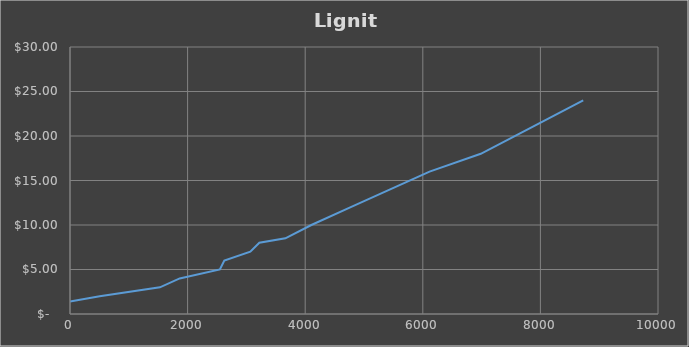
| Category | Series 0 |
|---|---|
| 0.0 | 1.4 |
| 504.57000000000005 | 2 |
| 1529.0 | 3 |
| 1865.6 | 4 |
| 2549.0 | 5 |
| 2624.57 | 6 |
| 3066.8069600000003 | 7 |
| 3220.23696 | 8 |
| 3662.4739200000004 | 8.5 |
| 4104.7108800000005 | 10 |
| 4774.76688 | 12 |
| 5444.82288 | 14 |
| 6114.878879999999 | 16 |
| 6985.951679999999 | 18 |
| 7857.024479999999 | 21 |
| 8728.097279999998 | 24 |